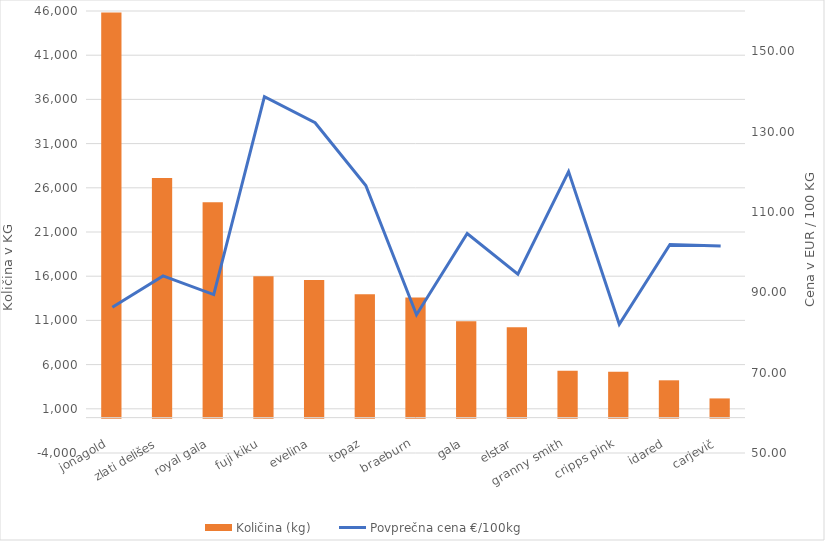
| Category | Količina (kg) |
|---|---|
| jonagold | 45843 |
| zlati delišes | 27099 |
| royal gala | 24366 |
| fuji kiku | 16001 |
| evelina | 15581 |
| topaz | 13950 |
| braeburn | 13596 |
| gala | 10915 |
| elstar | 10226 |
| granny smith | 5310 |
| cripps pink | 5196 |
| idared | 4223 |
| carjevič | 2174 |